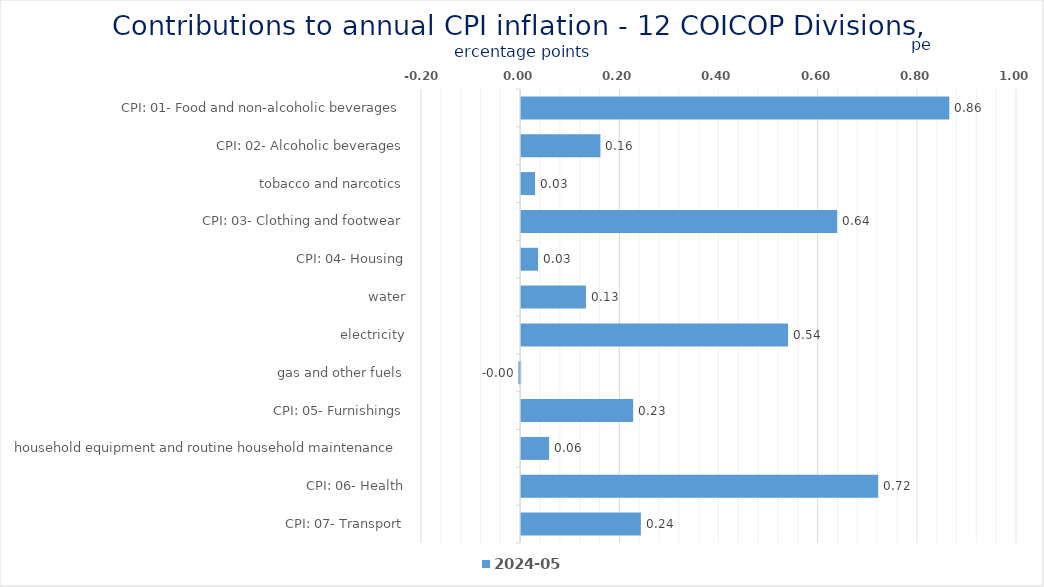
| Category | 2024-05 |
|---|---|
| CPI: 01- Food and non-alcoholic beverages | 0.863 |
| CPI: 02- Alcoholic beverages, tobacco and narcotics | 0.16 |
| CPI: 03- Clothing and footwear | 0.028 |
| CPI: 04- Housing, water, electricity, gas and other fuels | 0.637 |
| CPI: 05- Furnishings, household equipment and routine household maintenance | 0.034 |
| CPI: 06- Health | 0.131 |
| CPI: 07- Transport | 0.538 |
| CPI: 08- Communication | -0.004 |
| CPI: 09- Recreation and culture | 0.226 |
| CPI: 10- Education | 0.056 |
| CPI: 11- Restaurants and hotels | 0.72 |
| CPI: 12- Miscellaneous goods and services | 0.241 |